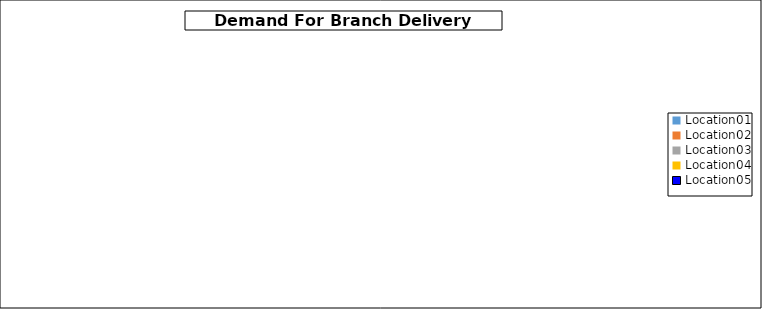
| Category | Data A |
|---|---|
| Location01 | 0 |
| Location02 | 0 |
| Location03 | 0 |
| Location04 | 0 |
| Location05 | 0 |